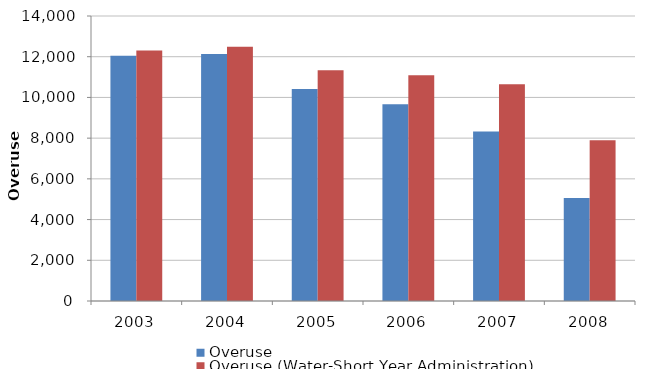
| Category | Overuse | Overuse (Water-Short Year Administration) |
|---|---|---|
| 2003.0 | 12050 | 12310 |
| 2004.0 | 12130 | 12490 |
| 2005.0 | 10420 | 11330 |
| 2006.0 | 9670 | 11090 |
| 2007.0 | 8330 | 10650 |
| 2008.0 | 5060 | 7900 |